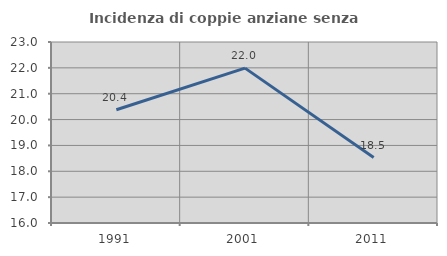
| Category | Incidenza di coppie anziane senza figli  |
|---|---|
| 1991.0 | 20.38 |
| 2001.0 | 21.99 |
| 2011.0 | 18.533 |